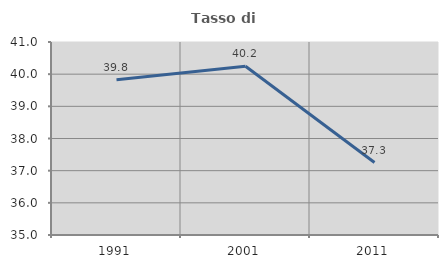
| Category | Tasso di occupazione   |
|---|---|
| 1991.0 | 39.828 |
| 2001.0 | 40.247 |
| 2011.0 | 37.254 |